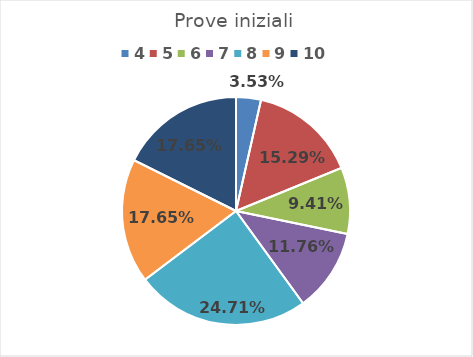
| Category | Series 0 |
|---|---|
| 4.0 | 0.035 |
| 5.0 | 0.153 |
| 6.0 | 0.094 |
| 7.0 | 0.118 |
| 8.0 | 0.247 |
| 9.0 | 0.176 |
| 10.0 | 0.176 |